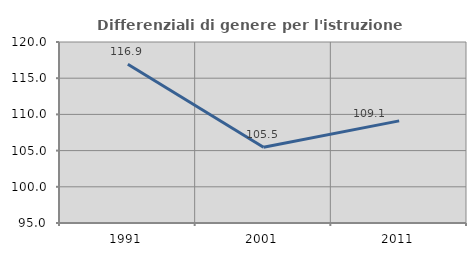
| Category | Differenziali di genere per l'istruzione superiore |
|---|---|
| 1991.0 | 116.925 |
| 2001.0 | 105.46 |
| 2011.0 | 109.102 |